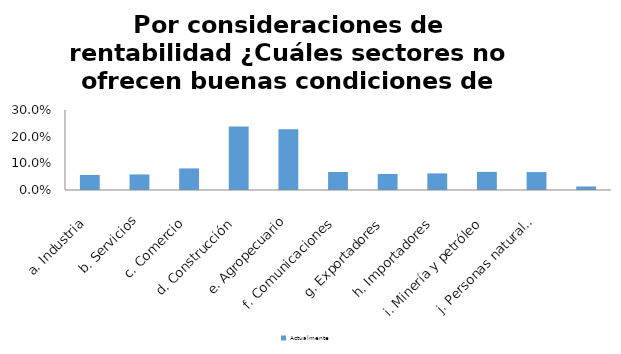
| Category | Actualmente |
|---|---|
| a. Industria | 0.057 |
| b. Servicios | 0.058 |
| c. Comercio | 0.081 |
| d. Construcción | 0.238 |
| e. Agropecuario | 0.227 |
| f. Comunicaciones | 0.067 |
| g. Exportadores | 0.06 |
| h. Importadores | 0.062 |
| i. Minería y petróleo | 0.068 |
| j. Personas naturales | 0.067 |